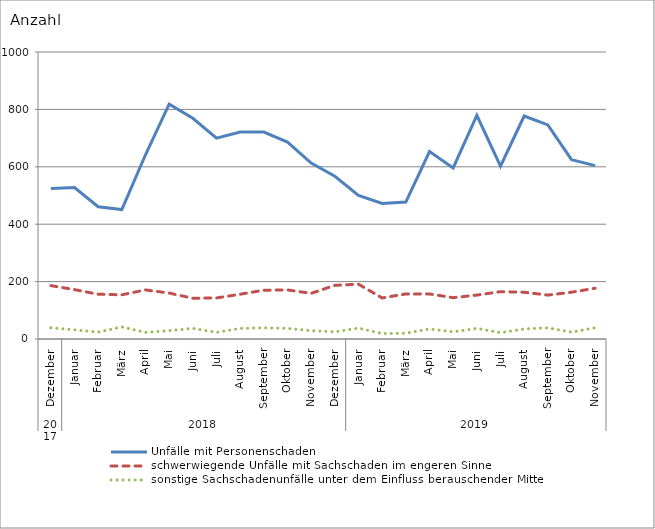
| Category | Unfälle mit Personenschaden | schwerwiegende Unfälle mit Sachschaden im engeren Sinne | sonstige Sachschadenunfälle unter dem Einfluss berauschender Mittel |
|---|---|---|---|
| 0 | 524 | 186 | 39 |
| 1 | 528 | 172 | 32 |
| 2 | 461 | 156 | 24 |
| 3 | 451 | 154 | 42 |
| 4 | 642 | 171 | 23 |
| 5 | 818 | 160 | 29 |
| 6 | 769 | 142 | 37 |
| 7 | 700 | 143 | 23 |
| 8 | 721 | 156 | 37 |
| 9 | 721 | 170 | 39 |
| 10 | 686 | 171 | 37 |
| 11 | 613 | 159 | 29 |
| 12 | 567 | 187 | 25 |
| 13 | 500 | 191 | 38 |
| 14 | 472 | 143 | 19 |
| 15 | 477 | 157 | 20 |
| 16 | 653 | 157 | 35 |
| 17 | 596 | 144 | 25 |
| 18 | 779 | 153 | 37 |
| 19 | 602 | 165 | 22 |
| 20 | 777 | 163 | 35 |
| 21 | 746 | 153 | 39 |
| 22 | 625 | 163 | 24 |
| 23 | 604 | 177 | 39 |